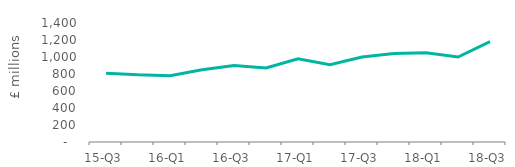
| Category | Full market |
|---|---|
| 15-Q3 | 810 |
| 15-Q4 | 790 |
| 16-Q1 | 780 |
| 16-Q2 | 850 |
| 16-Q3 | 900 |
| 16-Q4 | 870 |
| 17-Q1 | 980 |
| 17-Q2 | 910 |
| 17-Q3 | 1000 |
| 17-Q4 | 1040 |
| 18-Q1 | 1050 |
| 18-Q2 | 1000 |
| 18-Q3 | 1180 |